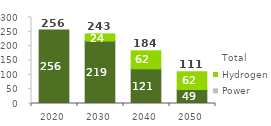
| Category | Final | Power | Hydrogen | Total |
|---|---|---|---|---|
| 2020.0 | 256.043 | 0 | 0 | 256.043 |
| 2030.0 | 218.546 | 0.347 | 24.046 | 242.939 |
| 2040.0 | 121.467 | 0.21 | 62.03 | 183.707 |
| 2050.0 | 48.657 | 0 | 62.03 | 110.687 |